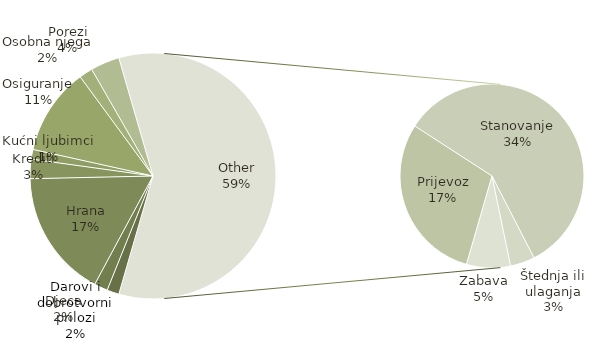
| Category | Zbroj |
|---|---|
| Darovi i dobrotvorni prilozi | 125 |
| Djeca | 140 |
| Hrana | 1320 |
| Krediti | 200 |
| Kućni ljubimci | 100 |
| Osiguranje | 900 |
| Osobna njega | 140 |
| Porezi | 300 |
| Prijevoz | 1375 |
| Stanovanje | 2702 |
| Štednja ili ulaganja | 200 |
| Zabava | 358 |